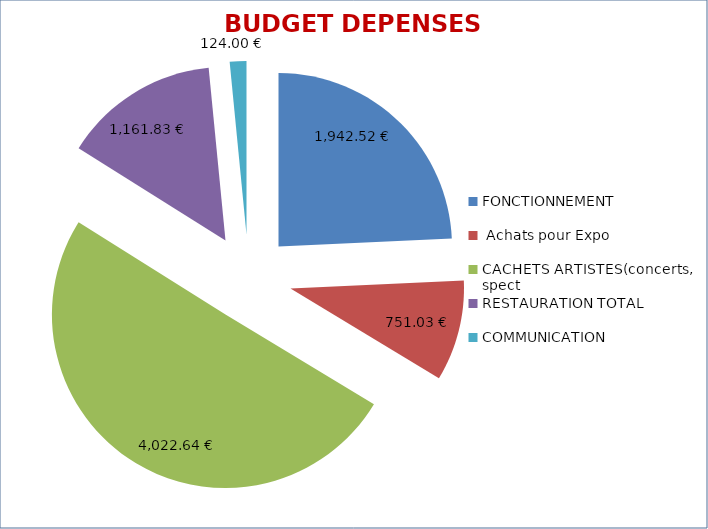
| Category | Series 0 |
|---|---|
| FONCTIONNEMENT | 1942.52 |
|  Achats pour Expo | 751.03 |
| CACHETS ARTISTES(concerts, spect | 4022.64 |
| RESTAURATION TOTAL | 1161.83 |
| COMMUNICATION | 124 |